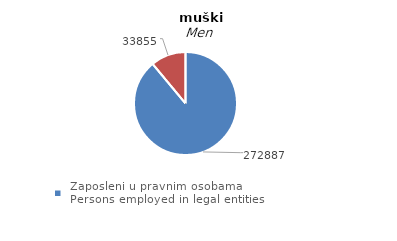
| Category | muški
Men |
|---|---|
|  Zaposleni u pravnim osobama
 Persons employed in legal entities  | 272887 |
| Zaposleni u obrtu i srodnim djelatnostima 
Persons employed in trades and related activities | 33855 |